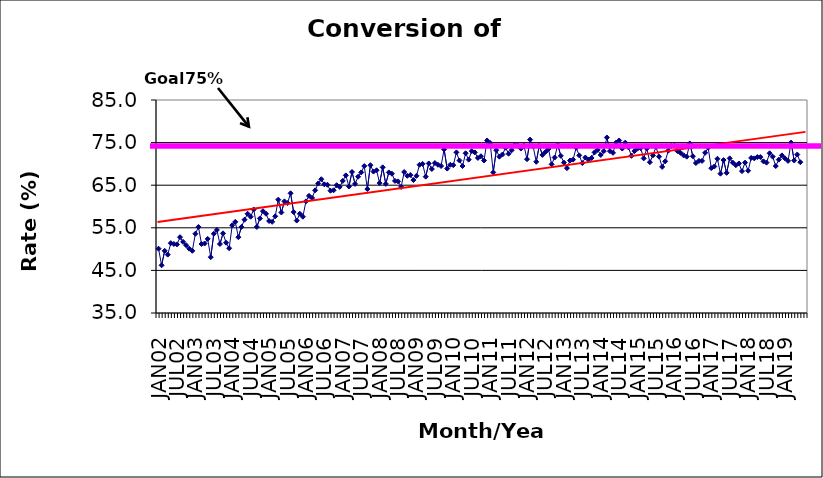
| Category | Series 0 |
|---|---|
| JAN02 | 50.1 |
| FEB02 | 46.2 |
| MAR02 | 49.6 |
| APR02 | 48.7 |
| MAY02 | 51.4 |
| JUN02 | 51.2 |
| JUL02 | 51.1 |
| AUG02 | 52.8 |
| SEP02 | 51.7 |
| OCT02 | 50.9 |
| NOV02 | 50.1 |
| DEC02 | 49.6 |
| JAN03 | 53.6 |
| FEB03 | 55.2 |
| MAR03 | 51.2 |
| APR03 | 51.3 |
| MAY03 | 52.4 |
| JUN03 | 48.1 |
| JUL03 | 53.6 |
| AUG03 | 54.5 |
| SEP03 | 51.2 |
| OCT03 | 53.7 |
| NOV03 | 51.5 |
| DEC03 | 50.2 |
| JAN04 | 55.6 |
| FEB04 | 56.4 |
| MAR04 | 52.8 |
| APR04 | 55.2 |
| MAY04 | 56.9 |
| JUN04 | 58.3 |
| JUL04 | 57.6 |
| AUG04 | 59.3 |
| SEP04 | 55.2 |
| OCT04 | 57.2 |
| NOV04 | 58.9 |
| DEC04 | 58.3 |
| JAN05 | 56.6 |
| FEB05 | 56.4 |
| MAR05 | 57.7 |
| APR05 | 61.6 |
| MAY05 | 58.6 |
| JUN05 | 61.2 |
| JUL05 | 60.8 |
| AUG05 | 63.1 |
| SEP05 | 58.7 |
| OCT05 | 56.7 |
| NOV05 | 58.3 |
| DEC05 | 57.6 |
| JAN06 | 61.2 |
| FEB06 | 62.5 |
| MAR06 | 62 |
| APR06 | 63.8 |
| MAY06 | 65.4 |
| JUN06 | 66.4 |
| JUL06 | 65.2 |
| AUG06 | 65.1 |
| SEP06 | 63.7 |
| OCT06 | 63.8 |
| NOV06 | 65 |
| DEC06 | 64.6 |
| JAN07 | 66 |
| FEB07 | 67.3 |
| MAR07 | 64.7 |
| APR07 | 68.1 |
| MAY07 | 65.3 |
| JUN07 | 67 |
| JUL07 | 68 |
| AUG07 | 69.5 |
| SEP07 | 64.1 |
| OCT07 | 69.7 |
| NOV07 | 68.2 |
| DEC07 | 68.5 |
| JAN08 | 65.5 |
| FEB08 | 69.2 |
| MAR08 | 65.3 |
| APR08 | 68 |
| MAY08 | 67.7 |
| JUN08 | 66 |
| JUL08 | 65.9 |
| AUG08 | 64.6 |
| SEP08 | 68.1 |
| OCT08 | 67.2 |
| NOV08 | 67.4 |
| DEC08 | 66.2 |
| JAN09 | 67.2 |
| FEB09 | 69.8 |
| MAR09 | 70 |
| APR09 | 67 |
| MAY09 | 70.1 |
| JUN09 | 68.8 |
| JUL09 | 70.2 |
| AUG09 | 69.8 |
| SEP09 | 69.5 |
| OCT09 | 73.4 |
| NOV09 | 68.9 |
| DEC09 | 69.8 |
| JAN10 | 69.7 |
| FEB10 | 72.7 |
| MAR10 | 70.8 |
| APR10 | 69.5 |
| MAY10 | 72.5 |
| JUN10 | 71 |
| JUL10 | 73 |
| AUG10 | 72.7 |
| SEP10 | 71.4 |
| OCT10 | 71.8 |
| NOV10 | 70.8 |
| DEC10 | 75.5 |
| JAN11 | 74.9 |
| FEB11 | 68 |
| MAR11 | 73.2 |
| APR11 | 71.7 |
| MAY11 | 72.2 |
| JUN11 | 73.8 |
| JUL11 | 72.4 |
| AUG11 | 73.2 |
| SEP11 | 74.5 |
| OCT11 | 74.3 |
| NOV11 | 73.6 |
| DEC11 | 74.3 |
| JAN12 | 71.1 |
| FEB12 | 75.7 |
| MAR12 | 74.1 |
| APR12 | 70.5 |
| MAY12 | 74.3 |
| JUN12 | 72.1 |
| JUL12 | 72.8 |
| AUG12 | 73.5 |
| SEP12 | 69.9 |
| OCT12 | 71.5 |
| NOV12 | 74.5 |
| DEC12 | 71.9 |
| JAN13 | 70.3 |
| FEB13 | 69 |
| MAR13 | 70.8 |
| APR13 | 71 |
| MAY13 | 73.8 |
| JUN13 | 72 |
| JUL13 | 70.2 |
| AUG13 | 71.5 |
| SEP13 | 71 |
| OCT13 | 71.4 |
| NOV13 | 72.7 |
| DEC13 | 73.3 |
| JAN14 | 72.1 |
| FEB14 | 73 |
| MAR14 | 76.2 |
| APR14 | 73 |
| MAY14 | 72.6 |
| JUN14 | 75 |
| JUL14 | 75.5 |
| AUG14 | 73.6 |
| SEP14 | 75 |
| OCT14 | 73.9 |
| NOV14 | 71.9 |
| DEC14 | 73 |
| JAN15 | 73.6 |
| FEB15 | 73.7 |
| MAR15 | 71.3 |
| APR15 | 73.6 |
| MAY15 | 70.4 |
| JUN15 | 72 |
| JUL15 | 74 |
| AUG15 | 71.7 |
| SEP15 | 69.3 |
| OCT15 | 70.6 |
| NOV15 | 73.1 |
| DEC15 | 74.2 |
| JAN16 | 74.3 |
| FEB16 | 73 |
| MAR16 | 72.6 |
| APR16 | 72 |
| MAY16 | 71.7 |
| JUN16 | 74.8 |
| JUL16 | 71.8 |
| AUG16 | 70.2 |
| SEP16 | 70.7 |
| OCT16 | 70.7 |
| NOV16 | 72.6 |
| DEC16 | 73.8 |
| JAN17 | 69 |
| FEB17 | 69.4 |
| MAR17 | 71.2 |
| APR17 | 67.7 |
| MAY17 | 70.9 |
| JUN17 | 67.9 |
| JUL17 | 71.3 |
| AUG17 | 70.3 |
| SEP17 | 69.7 |
| OCT17 | 70.1 |
| NOV17 | 68.3 |
| DEC17 | 70.3 |
| JAN18 | 68.4 |
| FEB18 | 71.4 |
| MAR18 | 71.3 |
| APR18 | 71.6 |
| MAY18 | 71.6 |
| JUN18 | 70.6 |
| JUL18 | 70.3 |
| AUG18 | 72.5 |
| SEP18 | 71.7 |
| OCT18 | 69.5 |
| NOV18 | 71 |
| DEC18 | 72 |
| JAN19 | 71.3 |
| FEB19 | 70.7 |
| MAR19 | 75 |
| APR19 | 70.8 |
| MAY19 | 72.2 |
| JUN19 | 70.4 |